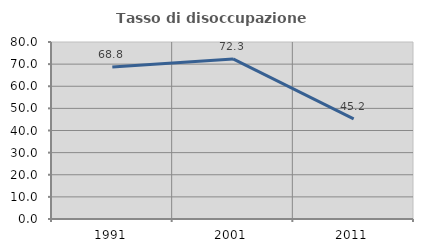
| Category | Tasso di disoccupazione giovanile  |
|---|---|
| 1991.0 | 68.75 |
| 2001.0 | 72.34 |
| 2011.0 | 45.238 |